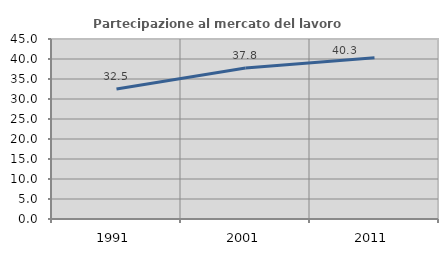
| Category | Partecipazione al mercato del lavoro  femminile |
|---|---|
| 1991.0 | 32.506 |
| 2001.0 | 37.776 |
| 2011.0 | 40.316 |